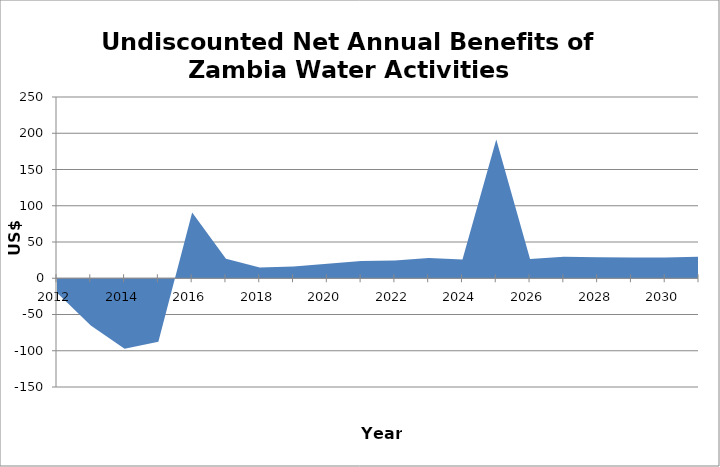
| Category | 2013 |
|---|---|
| 0 | -19.974 |
| 1 | -65.019 |
| 2 | -97.409 |
| 3 | -87.426 |
| 4 | 90.539 |
| 5 | 26.728 |
| 6 | 14.792 |
| 7 | 16.35 |
| 8 | 20.046 |
| 9 | 23.633 |
| 10 | 24.589 |
| 11 | 28.085 |
| 12 | 25.916 |
| 13 | 191.381 |
| 14 | 26.405 |
| 15 | 29.726 |
| 16 | 28.977 |
| 17 | 28.514 |
| 18 | 28.48 |
| 19 | 29.533 |